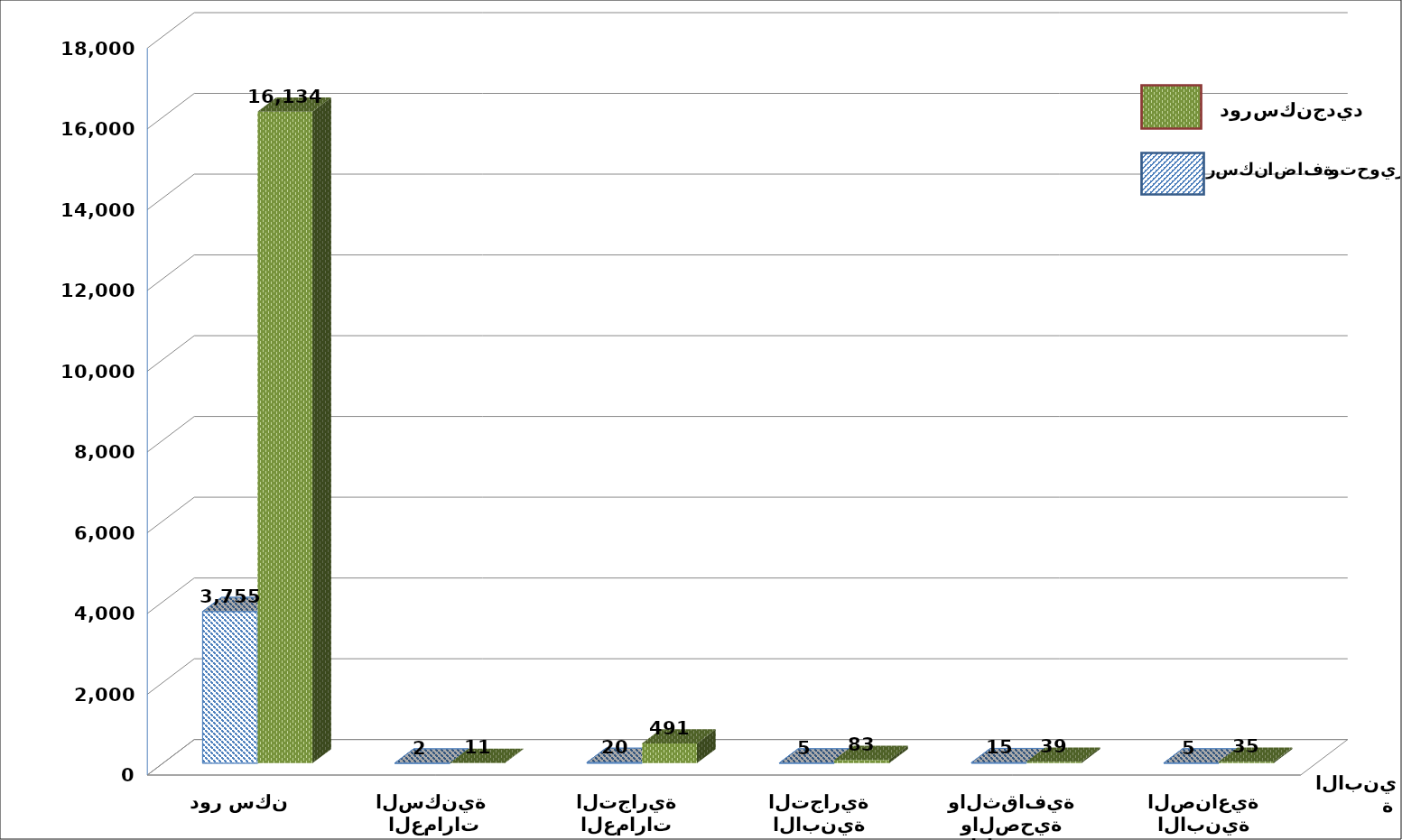
| Category | اضافة بناء | بناء جديد |
|---|---|---|
| دور سكن | 3755 | 16134 |
| العمارات السكنية  | 2 | 11 |
| العمارات التجارية | 20 | 491 |
| الابنية التجارية | 5 | 83 |
| الابنية الخدمية والدينية والصحية والثقافية | 15 | 39 |
| الابنية الصناعية | 5 | 35 |